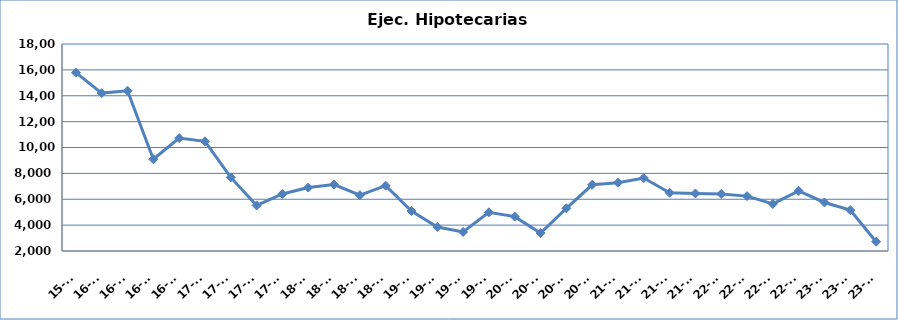
| Category | Ej. Hipotecarias |
|---|---|
| 15-T4 | 15785 |
| 16-T1 | 14205 |
| 16-T2 | 14385 |
| 16-T3 | 9094 |
| 16-T4 | 10726 |
| 17-T1 | 10478 |
| 17-T2 | 7689 |
| 17-T3 | 5518 |
| 17-T4 | 6409 |
| 18-T1 | 6903 |
| 18-T2 | 7137 |
| 18-T3 | 6315 |
| 18-T4 | 7049 |
| 19-T1 | 5092 |
| 19-T2 | 3857 |
| 19-T3 | 3470 |
| 19-T4 | 4992 |
| 20-T1 | 4658 |
| 20-T2 | 3387 |
| 20-T3 | 5299 |
| 20-T4 | 7116 |
| 21-T1 | 7280 |
| 21-T2 | 7641 |
| 21-T3 | 6504 |
| 21-T4 | 6449 |
| 22-T1 | 6410 |
| 22-T2 | 6242 |
| 22-T3 | 5637 |
| 22-T4 | 6646 |
| 23-T1 | 5751 |
| 23-T2 | 5161 |
| 23-T3 | 2716 |